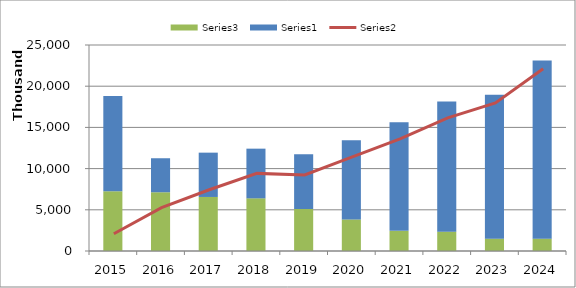
| Category | Series 2 | Series 0 |
|---|---|---|
| 2015.0 | 7257181 | 11538845 |
| 2016.0 | 7129323 | 4127675 |
| 2017.0 | 6557276 | 5378400 |
| 2018.0 | 6390929 | 6029408 |
| 2019.0 | 5108276 | 6629213 |
| 2020.0 | 3834612 | 9599774 |
| 2021.0 | 2450000 | 13166969 |
| 2022.0 | 2350000 | 15805899 |
| 2023.0 | 1500000 | 17468732 |
| 2024.0 | 1500000 | 21615231 |